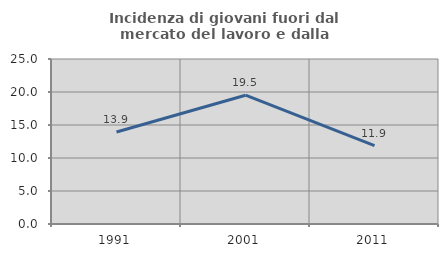
| Category | Incidenza di giovani fuori dal mercato del lavoro e dalla formazione  |
|---|---|
| 1991.0 | 13.945 |
| 2001.0 | 19.512 |
| 2011.0 | 11.881 |